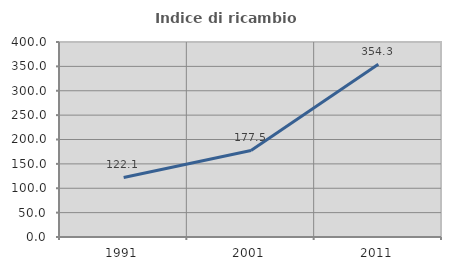
| Category | Indice di ricambio occupazionale  |
|---|---|
| 1991.0 | 122.078 |
| 2001.0 | 177.481 |
| 2011.0 | 354.309 |